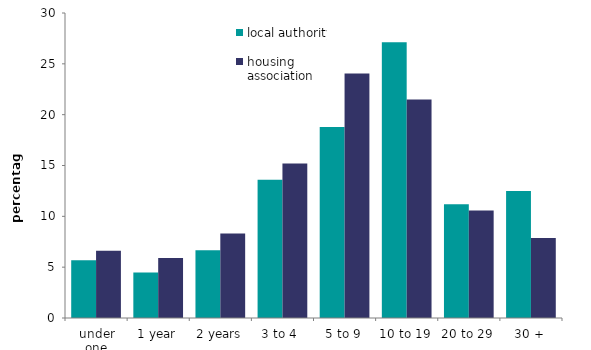
| Category | local authority | housing association |
|---|---|---|
| under one | 5.668 | 6.615 |
| 1 year | 4.466 | 5.913 |
| 2 years | 6.675 | 8.306 |
| 3 to 4  | 13.586 | 15.199 |
| 5 to 9 | 18.796 | 24.049 |
| 10 to 19 | 27.122 | 21.484 |
| 20 to 29 | 11.184 | 10.574 |
| 30 + | 12.503 | 7.86 |